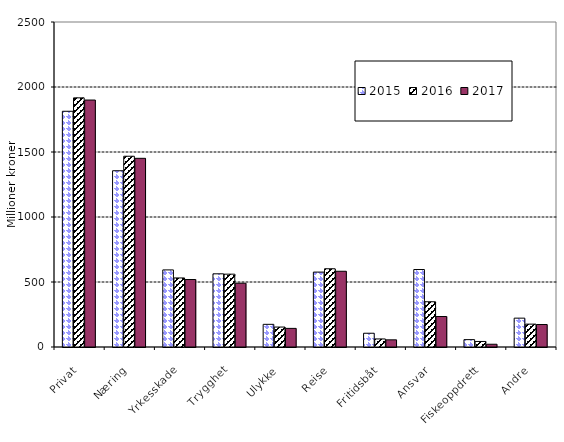
| Category | 2015 | 2016 | 2017 |
|---|---|---|---|
| Privat | 1813.252 | 1916.538 | 1899.654 |
| Næring | 1355.81 | 1467.402 | 1451.331 |
| Yrkesskade | 593.14 | 531.15 | 519.043 |
| Trygghet | 562.936 | 560.289 | 490.687 |
| Ulykke | 174.301 | 153.419 | 143.172 |
| Reise | 576.207 | 601.816 | 582.642 |
| Fritidsbåt | 105.77 | 61.956 | 55.114 |
| Ansvar | 595.919 | 348.152 | 234.477 |
| Fiskeoppdrett | 56.686 | 42.667 | 21.17 |
| Andre | 221.937 | 175.866 | 172.929 |